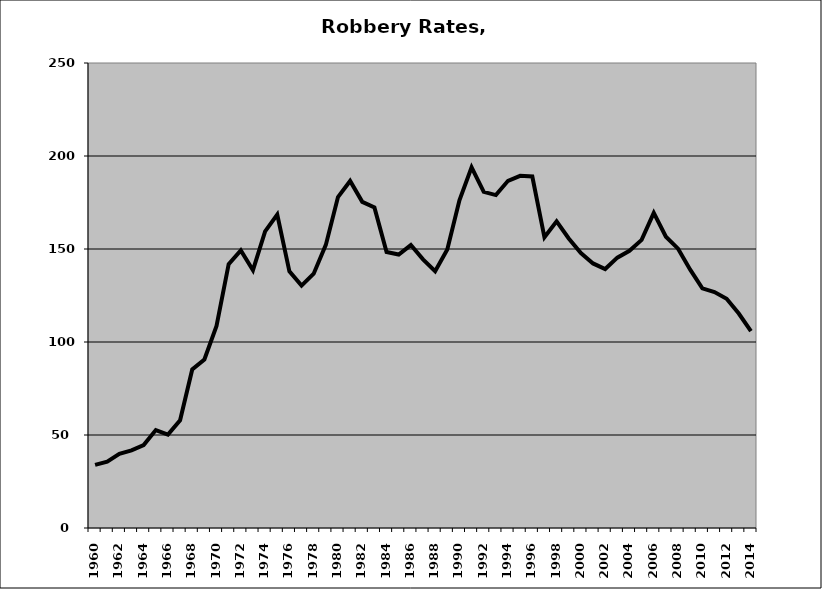
| Category | Robbery |
|---|---|
| 1960.0 | 33.924 |
| 1961.0 | 35.699 |
| 1962.0 | 39.856 |
| 1963.0 | 41.763 |
| 1964.0 | 44.602 |
| 1965.0 | 52.682 |
| 1966.0 | 50.207 |
| 1967.0 | 57.916 |
| 1968.0 | 85.22 |
| 1969.0 | 90.57 |
| 1970.0 | 108.615 |
| 1971.0 | 141.872 |
| 1972.0 | 149.254 |
| 1973.0 | 138.615 |
| 1974.0 | 159.493 |
| 1975.0 | 168.555 |
| 1976.0 | 137.97 |
| 1977.0 | 130.301 |
| 1978.0 | 136.715 |
| 1979.0 | 152.204 |
| 1980.0 | 177.931 |
| 1981.0 | 186.59 |
| 1982.0 | 175.356 |
| 1983.0 | 172.35 |
| 1984.0 | 148.357 |
| 1985.0 | 147.043 |
| 1986.0 | 152.115 |
| 1987.0 | 144.445 |
| 1988.0 | 138.081 |
| 1989.0 | 149.709 |
| 1990.0 | 176.154 |
| 1991.0 | 193.888 |
| 1992.0 | 180.706 |
| 1993.0 | 178.976 |
| 1994.0 | 186.666 |
| 1995.0 | 189.347 |
| 1996.0 | 188.985 |
| 1997.0 | 156.306 |
| 1998.0 | 164.878 |
| 1999.0 | 155.661 |
| 2000.0 | 147.829 |
| 2001.0 | 142.241 |
| 2002.0 | 139.21 |
| 2003.0 | 145.343 |
| 2004.0 | 149.05 |
| 2005.0 | 154.885 |
| 2006.0 | 169.381 |
| 2007.0 | 156.578 |
| 2008.0 | 150.187 |
| 2009.0 | 138.868 |
| 2010.0 | 128.811 |
| 2011.0 | 126.845 |
| 2012.0 | 123.272 |
| 2013.0 | 115.317 |
| 2014.0 | 105.84 |